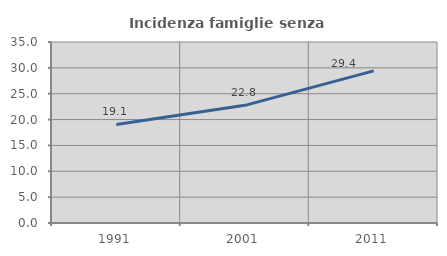
| Category | Incidenza famiglie senza nuclei |
|---|---|
| 1991.0 | 19.067 |
| 2001.0 | 22.751 |
| 2011.0 | 29.423 |